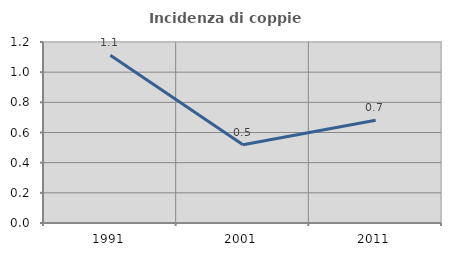
| Category | Incidenza di coppie miste |
|---|---|
| 1991.0 | 1.112 |
| 2001.0 | 0.519 |
| 2011.0 | 0.682 |